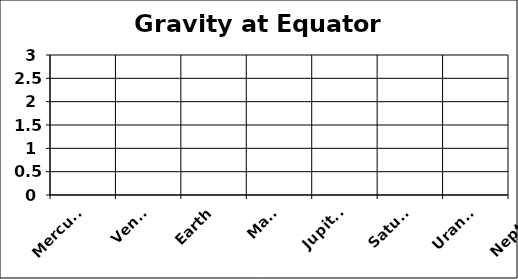
| Category | Gravity at Equator (Earth=1) |
|---|---|
| Mercury | 0.38 |
| Venus | 0.9 |
| Earth | 1 |
| Mars | 0.38 |
| Jupiter | 2.64 |
| Saturn | 0.93 |
| Uranus | 0.89 |
| Neptune | 1.12 |